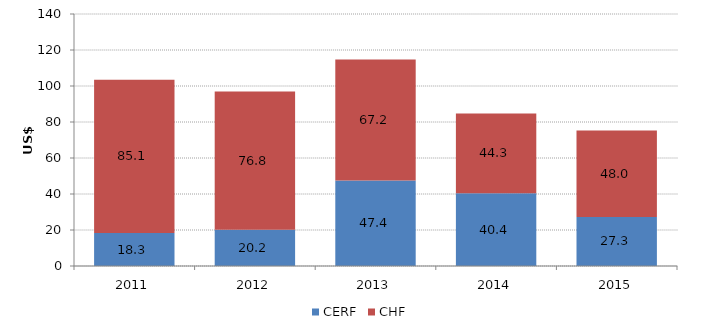
| Category | CERF | CHF |
|---|---|---|
| 2011.0 | 18.321 | 85.085 |
| 2012.0 | 20.158 | 76.811 |
| 2013.0 | 47.447 | 67.249 |
| 2014.0 | 40.447 | 44.323 |
| 2015.0 | 27.273 | 47.966 |